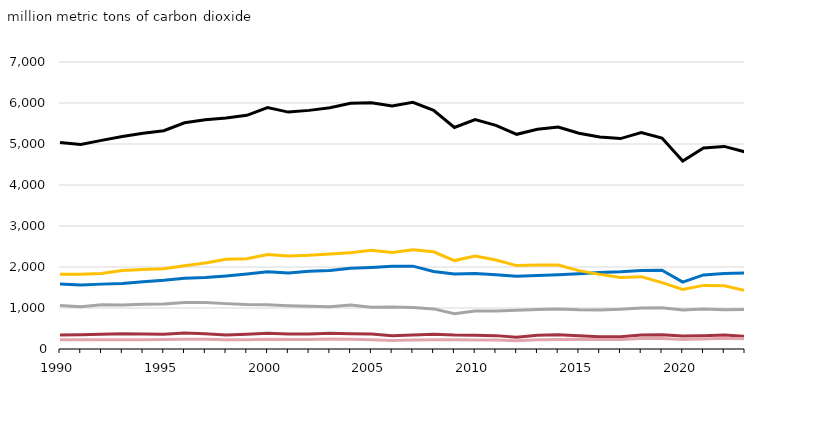
| Category | residential | commercial | industrial | transportation | electric power | total |
|---|---|---|---|---|---|---|
| 1990 | 339.974 | 226.088 | 1062.781 | 1583.54 | 1825.592 | 5037.975 |
| 1991 | 347.67 | 227.18 | 1029.623 | 1561.907 | 1824.425 | 4990.804 |
| 1992 | 357.54 | 228.302 | 1081.548 | 1582.342 | 1839.021 | 5088.755 |
| 1993 | 372.782 | 225.54 | 1071.94 | 1597.149 | 1914.625 | 5182.036 |
| 1994 | 364.771 | 228.218 | 1089.358 | 1640.034 | 1939.662 | 5262.042 |
| 1995 | 361.589 | 231.156 | 1099.265 | 1675.321 | 1957.083 | 5324.415 |
| 1996 | 390.012 | 239.841 | 1132.833 | 1725.387 | 2030.067 | 5518.141 |
| 1997 | 371.692 | 240.078 | 1135.5 | 1744.439 | 2097.745 | 5589.454 |
| 1998 | 338.89 | 222.775 | 1106.652 | 1781.929 | 2186.617 | 5636.862 |
| 1999 | 360.12 | 225.644 | 1086.39 | 1828.404 | 2199.83 | 5700.389 |
| 2000 | 381.325 | 239.607 | 1077.542 | 1884.038 | 2306.218 | 5888.731 |
| 2001 | 368.129 | 230.515 | 1055.705 | 1855.569 | 2268.004 | 5777.924 |
| 2002 | 368.551 | 231.348 | 1040.303 | 1895.093 | 2284.882 | 5820.177 |
| 2003 | 386.315 | 241.564 | 1031.591 | 1912.072 | 2315.027 | 5886.568 |
| 2004 | 372.672 | 238.076 | 1070.15 | 1966.822 | 2346.162 | 5993.882 |
| 2005 | 365.181 | 227.308 | 1016.014 | 1987.422 | 2411.224 | 6007.149 |
| 2006 | 323.694 | 207.775 | 1023.61 | 2018.57 | 2355.845 | 5929.496 |
| 2007 | 344.347 | 216.744 | 1011.192 | 2021.066 | 2422.349 | 6015.697 |
| 2008 | 357.699 | 225.963 | 978.054 | 1890.672 | 2370.886 | 5823.274 |
| 2009 | 338.713 | 223.207 | 858.468 | 1826.896 | 2156.543 | 5403.828 |
| 2010 | 336.114 | 220.905 | 924.42 | 1842.313 | 2270.063 | 5593.816 |
| 2011 | 326.176 | 221.789 | 928.933 | 1808.271 | 2169.682 | 5454.851 |
| 2012 | 286.272 | 201.049 | 942.891 | 1771.596 | 2034.67 | 5236.478 |
| 2013 | 332.52 | 222.721 | 963.247 | 1791.218 | 2049.312 | 5359.017 |
| 2014 | 349.088 | 233.948 | 973.148 | 1809.471 | 2048.372 | 5414.028 |
| 2015 | 322.391 | 239.575 | 955.104 | 1833.283 | 1911.848 | 5262.2 |
| 2016 | 298.652 | 231.578 | 953.419 | 1865.4 | 1819.995 | 5169.044 |
| 2017 | 301.194 | 232.997 | 971.411 | 1883.321 | 1742.607 | 5131.529 |
| 2018 | 343.865 | 253.766 | 1001.426 | 1914.632 | 1764.195 | 5277.882 |
| 2019 | 346.662 | 254.861 | 1006.942 | 1920.968 | 1617.56 | 5146.993 |
| 2020 | 318.575 | 232.682 | 952.012 | 1630.226 | 1450.196 | 4583.69 |
| 2021 | 324.941 | 244.749 | 977.157 | 1806.574 | 1551.148 | 4904.57 |
| 2022 | 338.706 | 261.203 | 959.717 | 1839.901 | 1541.708 | 4941.236 |
| 2023 | 311.212 | 249.689 | 963.46 | 1855.618 | 1426.963 | 4806.942 |